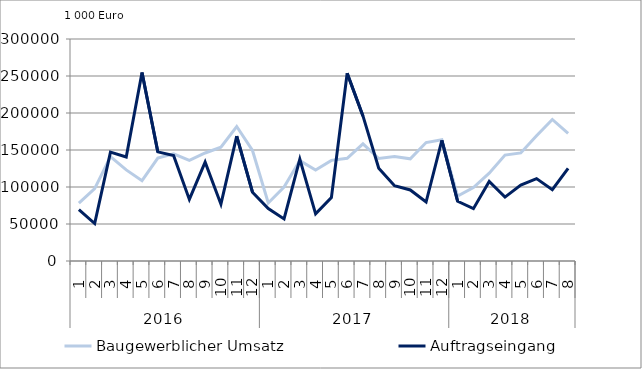
| Category | Baugewerblicher Umsatz | Auftragseingang |
|---|---|---|
| 0 | 78291.738 | 69470.357 |
| 1 | 97863.379 | 50640.033 |
| 2 | 141176.119 | 147206.65 |
| 3 | 123121.297 | 140579.009 |
| 4 | 108561.124 | 254739.334 |
| 5 | 139030.209 | 147481.644 |
| 6 | 144784.416 | 142609.658 |
| 7 | 135870.195 | 83192.156 |
| 8 | 145961.738 | 133594.351 |
| 9 | 153886.826 | 76793.838 |
| 10 | 181740.037 | 168867.568 |
| 11 | 149348.138 | 93011.853 |
| 12 | 78446.78 | 70908.903 |
| 13 | 99841.908 | 56868.408 |
| 14 | 135679.867 | 137790.423 |
| 15 | 123004.403 | 63637.761 |
| 16 | 136010.071 | 85644.63 |
| 17 | 138859.308 | 253791.552 |
| 18 | 158353.879 | 196034.198 |
| 19 | 138510.315 | 125319.873 |
| 20 | 141109.925 | 101690.626 |
| 21 | 138067.098 | 95966.626 |
| 22 | 160064.454 | 79701.993 |
| 23 | 163969.017 | 162878.607 |
| 24 | 87640.529 | 80684.627 |
| 25 | 99259.455 | 70746.763 |
| 26 | 118764.324 | 107538.747 |
| 27 | 143144.178 | 86374.619 |
| 28 | 146070.782 | 102661.329 |
| 29 | 169150.753 | 111287.709 |
| 30 | 191277.885 | 96286.662 |
| 31 | 172425.535 | 125142.495 |